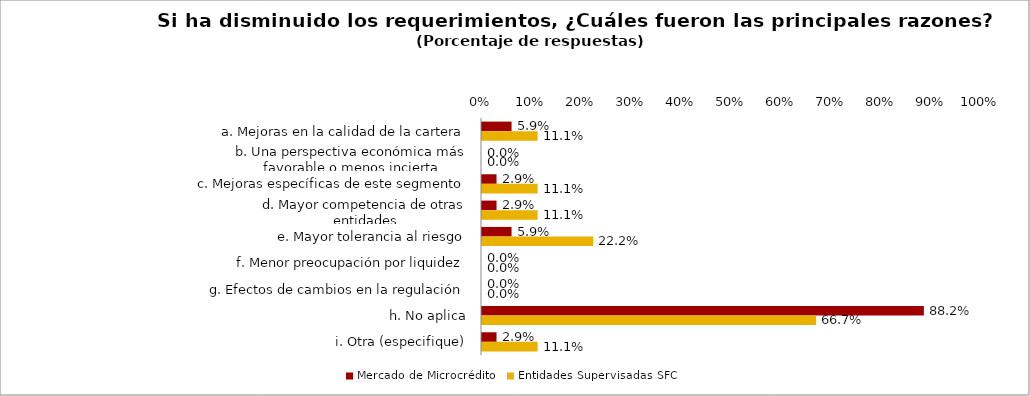
| Category | Mercado de Microcrédito | Entidades Supervisadas SFC |
|---|---|---|
| a. Mejoras en la calidad de la cartera | 0.059 | 0.111 |
| b. Una perspectiva económica más favorable o menos incierta | 0 | 0 |
| c. Mejoras específicas de este segmento | 0.029 | 0.111 |
| d. Mayor competencia de otras entidades | 0.029 | 0.111 |
| e. Mayor tolerancia al riesgo | 0.059 | 0.222 |
| f. Menor preocupación por liquidez | 0 | 0 |
| g. Efectos de cambios en la regulación | 0 | 0 |
| h. No aplica | 0.882 | 0.667 |
| i. Otra (especifique) | 0.029 | 0.111 |